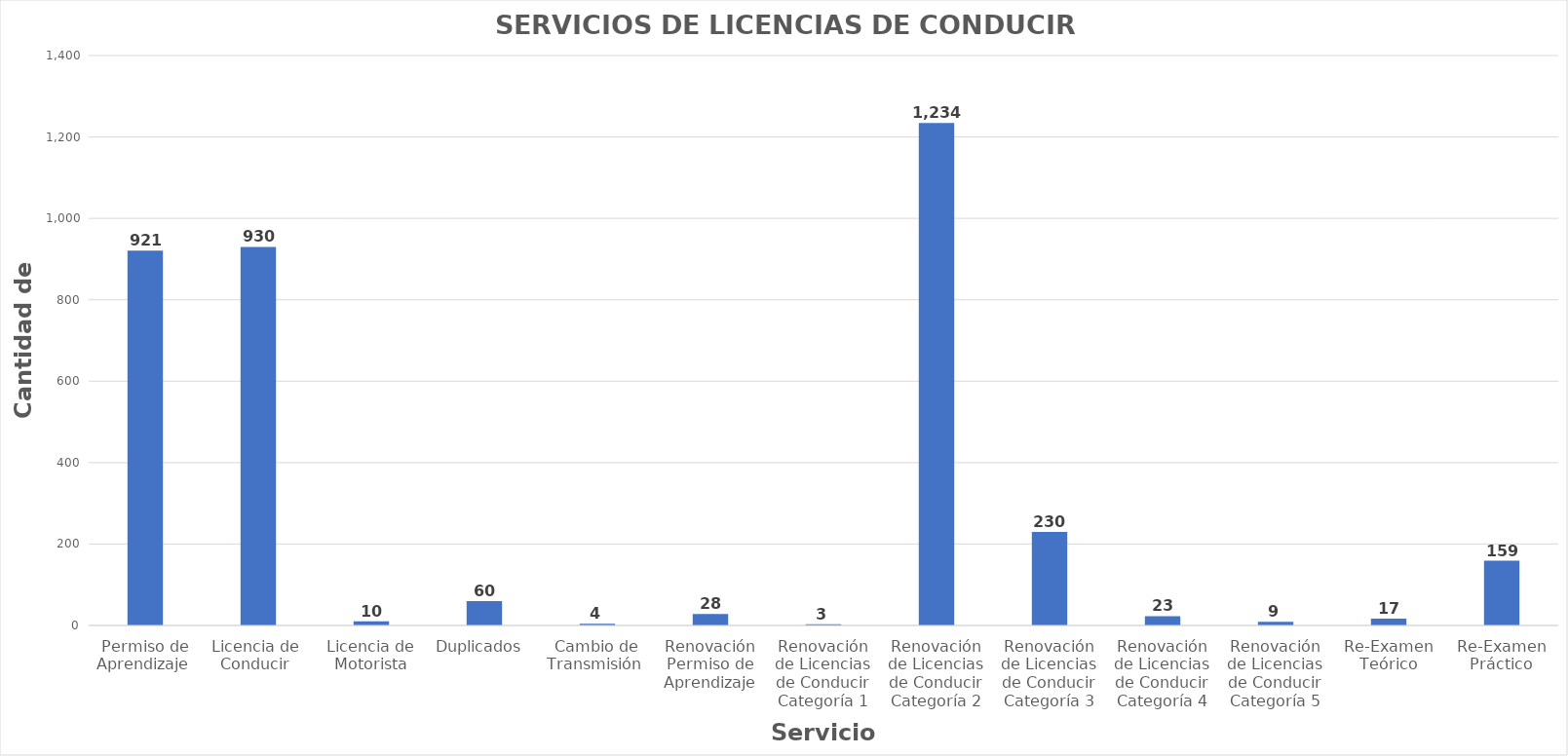
| Category | Series 0 |
|---|---|
| Permiso de Aprendizaje  | 921 |
| Licencia de  Conducir  | 930 |
| Licencia de Motorista | 10 |
| Duplicados  | 60 |
| Cambio de Transmisión  | 4 |
| Renovación Permiso de Aprendizaje | 28 |
| Renovación de Licencias de Conducir Categoría 1 | 3 |
| Renovación de Licencias de Conducir Categoría 2 | 1234 |
| Renovación de Licencias de Conducir Categoría 3 | 230 |
| Renovación de Licencias de Conducir Categoría 4 | 23 |
| Renovación de Licencias de Conducir Categoría 5 | 9 |
| Re-Examen Teórico | 17 |
| Re-Examen Práctico | 159 |